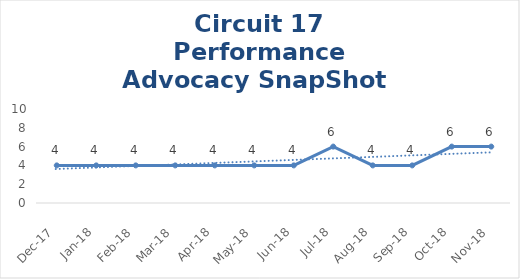
| Category | Circuit 17 |
|---|---|
| Dec-17 | 4 |
| Jan-18 | 4 |
| Feb-18 | 4 |
| Mar-18 | 4 |
| Apr-18 | 4 |
| May-18 | 4 |
| Jun-18 | 4 |
| Jul-18 | 6 |
| Aug-18 | 4 |
| Sep-18 | 4 |
| Oct-18 | 6 |
| Nov-18 | 6 |